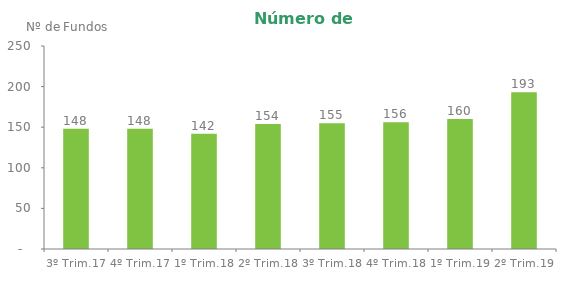
| Category | Series 0 |
|---|---|
| 3º Trim.17 | 148 |
| 4º Trim.17 | 148 |
| 1º Trim.18 | 142 |
| 2º Trim.18 | 154 |
| 3º Trim.18 | 155 |
| 4º Trim.18 | 156 |
| 1º Trim.19 | 160 |
| 2º Trim.19 | 193 |